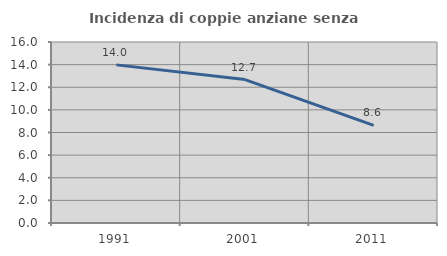
| Category | Incidenza di coppie anziane senza figli  |
|---|---|
| 1991.0 | 13.978 |
| 2001.0 | 12.676 |
| 2011.0 | 8.625 |